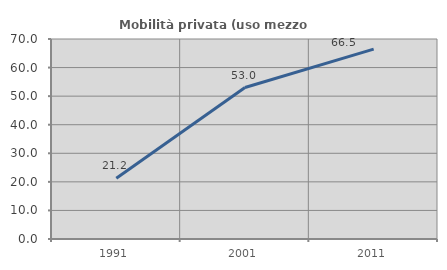
| Category | Mobilità privata (uso mezzo privato) |
|---|---|
| 1991.0 | 21.229 |
| 2001.0 | 53.005 |
| 2011.0 | 66.463 |